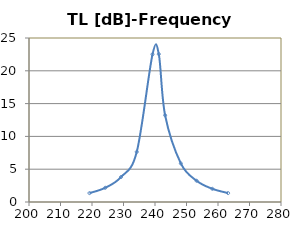
| Category | TL-Frequency |
|---|---|
| 219.2089730444785 | 1.357 |
| 224.2089730444785 | 2.167 |
| 229.2089730444785 | 3.803 |
| 234.2089730444785 | 7.642 |
| 239.2089730444785 | 22.502 |
| 241.2089730444785 | 22.538 |
| 243.2089730444785 | 13.219 |
| 248.2089730444785 | 5.874 |
| 253.2089730444785 | 3.237 |
| 258.2089730444785 | 2.01 |
| 263.2089730444785 | 1.358 |